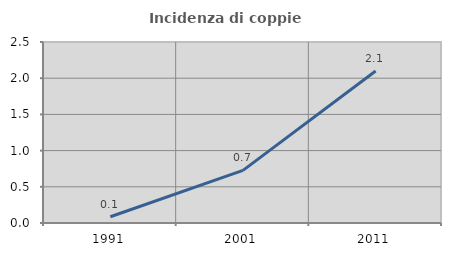
| Category | Incidenza di coppie miste |
|---|---|
| 1991.0 | 0.086 |
| 2001.0 | 0.727 |
| 2011.0 | 2.1 |